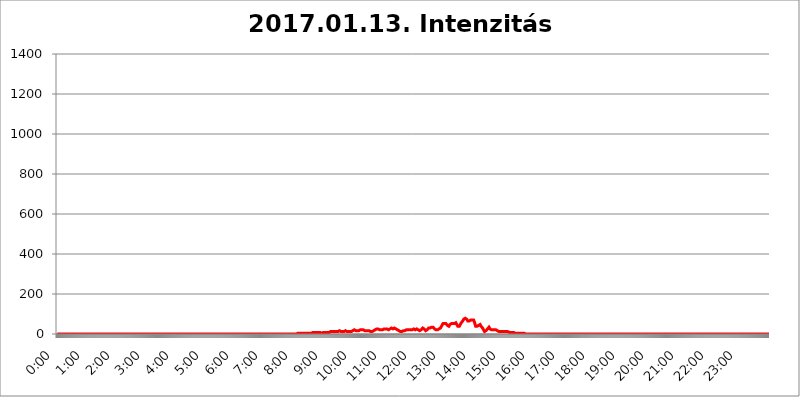
| Category | 2017.01.13. Intenzitás [W/m^2] |
|---|---|
| 0.0 | 0 |
| 0.0006944444444444445 | 0 |
| 0.001388888888888889 | 0 |
| 0.0020833333333333333 | 0 |
| 0.002777777777777778 | 0 |
| 0.003472222222222222 | 0 |
| 0.004166666666666667 | 0 |
| 0.004861111111111111 | 0 |
| 0.005555555555555556 | 0 |
| 0.0062499999999999995 | 0 |
| 0.006944444444444444 | 0 |
| 0.007638888888888889 | 0 |
| 0.008333333333333333 | 0 |
| 0.009027777777777779 | 0 |
| 0.009722222222222222 | 0 |
| 0.010416666666666666 | 0 |
| 0.011111111111111112 | 0 |
| 0.011805555555555555 | 0 |
| 0.012499999999999999 | 0 |
| 0.013194444444444444 | 0 |
| 0.013888888888888888 | 0 |
| 0.014583333333333332 | 0 |
| 0.015277777777777777 | 0 |
| 0.015972222222222224 | 0 |
| 0.016666666666666666 | 0 |
| 0.017361111111111112 | 0 |
| 0.018055555555555557 | 0 |
| 0.01875 | 0 |
| 0.019444444444444445 | 0 |
| 0.02013888888888889 | 0 |
| 0.020833333333333332 | 0 |
| 0.02152777777777778 | 0 |
| 0.022222222222222223 | 0 |
| 0.02291666666666667 | 0 |
| 0.02361111111111111 | 0 |
| 0.024305555555555556 | 0 |
| 0.024999999999999998 | 0 |
| 0.025694444444444447 | 0 |
| 0.02638888888888889 | 0 |
| 0.027083333333333334 | 0 |
| 0.027777777777777776 | 0 |
| 0.02847222222222222 | 0 |
| 0.029166666666666664 | 0 |
| 0.029861111111111113 | 0 |
| 0.030555555555555555 | 0 |
| 0.03125 | 0 |
| 0.03194444444444445 | 0 |
| 0.03263888888888889 | 0 |
| 0.03333333333333333 | 0 |
| 0.034027777777777775 | 0 |
| 0.034722222222222224 | 0 |
| 0.035416666666666666 | 0 |
| 0.036111111111111115 | 0 |
| 0.03680555555555556 | 0 |
| 0.0375 | 0 |
| 0.03819444444444444 | 0 |
| 0.03888888888888889 | 0 |
| 0.03958333333333333 | 0 |
| 0.04027777777777778 | 0 |
| 0.04097222222222222 | 0 |
| 0.041666666666666664 | 0 |
| 0.042361111111111106 | 0 |
| 0.04305555555555556 | 0 |
| 0.043750000000000004 | 0 |
| 0.044444444444444446 | 0 |
| 0.04513888888888889 | 0 |
| 0.04583333333333334 | 0 |
| 0.04652777777777778 | 0 |
| 0.04722222222222222 | 0 |
| 0.04791666666666666 | 0 |
| 0.04861111111111111 | 0 |
| 0.049305555555555554 | 0 |
| 0.049999999999999996 | 0 |
| 0.05069444444444445 | 0 |
| 0.051388888888888894 | 0 |
| 0.052083333333333336 | 0 |
| 0.05277777777777778 | 0 |
| 0.05347222222222222 | 0 |
| 0.05416666666666667 | 0 |
| 0.05486111111111111 | 0 |
| 0.05555555555555555 | 0 |
| 0.05625 | 0 |
| 0.05694444444444444 | 0 |
| 0.057638888888888885 | 0 |
| 0.05833333333333333 | 0 |
| 0.05902777777777778 | 0 |
| 0.059722222222222225 | 0 |
| 0.06041666666666667 | 0 |
| 0.061111111111111116 | 0 |
| 0.06180555555555556 | 0 |
| 0.0625 | 0 |
| 0.06319444444444444 | 0 |
| 0.06388888888888888 | 0 |
| 0.06458333333333334 | 0 |
| 0.06527777777777778 | 0 |
| 0.06597222222222222 | 0 |
| 0.06666666666666667 | 0 |
| 0.06736111111111111 | 0 |
| 0.06805555555555555 | 0 |
| 0.06874999999999999 | 0 |
| 0.06944444444444443 | 0 |
| 0.07013888888888889 | 0 |
| 0.07083333333333333 | 0 |
| 0.07152777777777779 | 0 |
| 0.07222222222222223 | 0 |
| 0.07291666666666667 | 0 |
| 0.07361111111111111 | 0 |
| 0.07430555555555556 | 0 |
| 0.075 | 0 |
| 0.07569444444444444 | 0 |
| 0.0763888888888889 | 0 |
| 0.07708333333333334 | 0 |
| 0.07777777777777778 | 0 |
| 0.07847222222222222 | 0 |
| 0.07916666666666666 | 0 |
| 0.0798611111111111 | 0 |
| 0.08055555555555556 | 0 |
| 0.08125 | 0 |
| 0.08194444444444444 | 0 |
| 0.08263888888888889 | 0 |
| 0.08333333333333333 | 0 |
| 0.08402777777777777 | 0 |
| 0.08472222222222221 | 0 |
| 0.08541666666666665 | 0 |
| 0.08611111111111112 | 0 |
| 0.08680555555555557 | 0 |
| 0.08750000000000001 | 0 |
| 0.08819444444444445 | 0 |
| 0.08888888888888889 | 0 |
| 0.08958333333333333 | 0 |
| 0.09027777777777778 | 0 |
| 0.09097222222222222 | 0 |
| 0.09166666666666667 | 0 |
| 0.09236111111111112 | 0 |
| 0.09305555555555556 | 0 |
| 0.09375 | 0 |
| 0.09444444444444444 | 0 |
| 0.09513888888888888 | 0 |
| 0.09583333333333333 | 0 |
| 0.09652777777777777 | 0 |
| 0.09722222222222222 | 0 |
| 0.09791666666666667 | 0 |
| 0.09861111111111111 | 0 |
| 0.09930555555555555 | 0 |
| 0.09999999999999999 | 0 |
| 0.10069444444444443 | 0 |
| 0.1013888888888889 | 0 |
| 0.10208333333333335 | 0 |
| 0.10277777777777779 | 0 |
| 0.10347222222222223 | 0 |
| 0.10416666666666667 | 0 |
| 0.10486111111111111 | 0 |
| 0.10555555555555556 | 0 |
| 0.10625 | 0 |
| 0.10694444444444444 | 0 |
| 0.1076388888888889 | 0 |
| 0.10833333333333334 | 0 |
| 0.10902777777777778 | 0 |
| 0.10972222222222222 | 0 |
| 0.1111111111111111 | 0 |
| 0.11180555555555556 | 0 |
| 0.11180555555555556 | 0 |
| 0.1125 | 0 |
| 0.11319444444444444 | 0 |
| 0.11388888888888889 | 0 |
| 0.11458333333333333 | 0 |
| 0.11527777777777777 | 0 |
| 0.11597222222222221 | 0 |
| 0.11666666666666665 | 0 |
| 0.1173611111111111 | 0 |
| 0.11805555555555557 | 0 |
| 0.11944444444444445 | 0 |
| 0.12013888888888889 | 0 |
| 0.12083333333333333 | 0 |
| 0.12152777777777778 | 0 |
| 0.12222222222222223 | 0 |
| 0.12291666666666667 | 0 |
| 0.12291666666666667 | 0 |
| 0.12361111111111112 | 0 |
| 0.12430555555555556 | 0 |
| 0.125 | 0 |
| 0.12569444444444444 | 0 |
| 0.12638888888888888 | 0 |
| 0.12708333333333333 | 0 |
| 0.16875 | 0 |
| 0.12847222222222224 | 0 |
| 0.12916666666666668 | 0 |
| 0.12986111111111112 | 0 |
| 0.13055555555555556 | 0 |
| 0.13125 | 0 |
| 0.13194444444444445 | 0 |
| 0.1326388888888889 | 0 |
| 0.13333333333333333 | 0 |
| 0.13402777777777777 | 0 |
| 0.13402777777777777 | 0 |
| 0.13472222222222222 | 0 |
| 0.13541666666666666 | 0 |
| 0.1361111111111111 | 0 |
| 0.13749999999999998 | 0 |
| 0.13819444444444443 | 0 |
| 0.1388888888888889 | 0 |
| 0.13958333333333334 | 0 |
| 0.14027777777777778 | 0 |
| 0.14097222222222222 | 0 |
| 0.14166666666666666 | 0 |
| 0.1423611111111111 | 0 |
| 0.14305555555555557 | 0 |
| 0.14375000000000002 | 0 |
| 0.14444444444444446 | 0 |
| 0.1451388888888889 | 0 |
| 0.1451388888888889 | 0 |
| 0.14652777777777778 | 0 |
| 0.14722222222222223 | 0 |
| 0.14791666666666667 | 0 |
| 0.1486111111111111 | 0 |
| 0.14930555555555555 | 0 |
| 0.15 | 0 |
| 0.15069444444444444 | 0 |
| 0.15138888888888888 | 0 |
| 0.15208333333333332 | 0 |
| 0.15277777777777776 | 0 |
| 0.15347222222222223 | 0 |
| 0.15416666666666667 | 0 |
| 0.15486111111111112 | 0 |
| 0.15555555555555556 | 0 |
| 0.15625 | 0 |
| 0.15694444444444444 | 0 |
| 0.15763888888888888 | 0 |
| 0.15833333333333333 | 0 |
| 0.15902777777777777 | 0 |
| 0.15972222222222224 | 0 |
| 0.16041666666666668 | 0 |
| 0.16111111111111112 | 0 |
| 0.16180555555555556 | 0 |
| 0.1625 | 0 |
| 0.16319444444444445 | 0 |
| 0.1638888888888889 | 0 |
| 0.16458333333333333 | 0 |
| 0.16527777777777777 | 0 |
| 0.16597222222222222 | 0 |
| 0.16666666666666666 | 0 |
| 0.1673611111111111 | 0 |
| 0.16805555555555554 | 0 |
| 0.16874999999999998 | 0 |
| 0.16944444444444443 | 0 |
| 0.17013888888888887 | 0 |
| 0.1708333333333333 | 0 |
| 0.17152777777777775 | 0 |
| 0.17222222222222225 | 0 |
| 0.1729166666666667 | 0 |
| 0.17361111111111113 | 0 |
| 0.17430555555555557 | 0 |
| 0.17500000000000002 | 0 |
| 0.17569444444444446 | 0 |
| 0.1763888888888889 | 0 |
| 0.17708333333333334 | 0 |
| 0.17777777777777778 | 0 |
| 0.17847222222222223 | 0 |
| 0.17916666666666667 | 0 |
| 0.1798611111111111 | 0 |
| 0.18055555555555555 | 0 |
| 0.18125 | 0 |
| 0.18194444444444444 | 0 |
| 0.1826388888888889 | 0 |
| 0.18333333333333335 | 0 |
| 0.1840277777777778 | 0 |
| 0.18472222222222223 | 0 |
| 0.18541666666666667 | 0 |
| 0.18611111111111112 | 0 |
| 0.18680555555555556 | 0 |
| 0.1875 | 0 |
| 0.18819444444444444 | 0 |
| 0.18888888888888888 | 0 |
| 0.18958333333333333 | 0 |
| 0.19027777777777777 | 0 |
| 0.1909722222222222 | 0 |
| 0.19166666666666665 | 0 |
| 0.19236111111111112 | 0 |
| 0.19305555555555554 | 0 |
| 0.19375 | 0 |
| 0.19444444444444445 | 0 |
| 0.1951388888888889 | 0 |
| 0.19583333333333333 | 0 |
| 0.19652777777777777 | 0 |
| 0.19722222222222222 | 0 |
| 0.19791666666666666 | 0 |
| 0.1986111111111111 | 0 |
| 0.19930555555555554 | 0 |
| 0.19999999999999998 | 0 |
| 0.20069444444444443 | 0 |
| 0.20138888888888887 | 0 |
| 0.2020833333333333 | 0 |
| 0.2027777777777778 | 0 |
| 0.2034722222222222 | 0 |
| 0.2041666666666667 | 0 |
| 0.20486111111111113 | 0 |
| 0.20555555555555557 | 0 |
| 0.20625000000000002 | 0 |
| 0.20694444444444446 | 0 |
| 0.2076388888888889 | 0 |
| 0.20833333333333334 | 0 |
| 0.20902777777777778 | 0 |
| 0.20972222222222223 | 0 |
| 0.21041666666666667 | 0 |
| 0.2111111111111111 | 0 |
| 0.21180555555555555 | 0 |
| 0.2125 | 0 |
| 0.21319444444444444 | 0 |
| 0.2138888888888889 | 0 |
| 0.21458333333333335 | 0 |
| 0.2152777777777778 | 0 |
| 0.21597222222222223 | 0 |
| 0.21666666666666667 | 0 |
| 0.21736111111111112 | 0 |
| 0.21805555555555556 | 0 |
| 0.21875 | 0 |
| 0.21944444444444444 | 0 |
| 0.22013888888888888 | 0 |
| 0.22083333333333333 | 0 |
| 0.22152777777777777 | 0 |
| 0.2222222222222222 | 0 |
| 0.22291666666666665 | 0 |
| 0.2236111111111111 | 0 |
| 0.22430555555555556 | 0 |
| 0.225 | 0 |
| 0.22569444444444445 | 0 |
| 0.2263888888888889 | 0 |
| 0.22708333333333333 | 0 |
| 0.22777777777777777 | 0 |
| 0.22847222222222222 | 0 |
| 0.22916666666666666 | 0 |
| 0.2298611111111111 | 0 |
| 0.23055555555555554 | 0 |
| 0.23124999999999998 | 0 |
| 0.23194444444444443 | 0 |
| 0.23263888888888887 | 0 |
| 0.2333333333333333 | 0 |
| 0.2340277777777778 | 0 |
| 0.2347222222222222 | 0 |
| 0.2354166666666667 | 0 |
| 0.23611111111111113 | 0 |
| 0.23680555555555557 | 0 |
| 0.23750000000000002 | 0 |
| 0.23819444444444446 | 0 |
| 0.2388888888888889 | 0 |
| 0.23958333333333334 | 0 |
| 0.24027777777777778 | 0 |
| 0.24097222222222223 | 0 |
| 0.24166666666666667 | 0 |
| 0.2423611111111111 | 0 |
| 0.24305555555555555 | 0 |
| 0.24375 | 0 |
| 0.24444444444444446 | 0 |
| 0.24513888888888888 | 0 |
| 0.24583333333333335 | 0 |
| 0.2465277777777778 | 0 |
| 0.24722222222222223 | 0 |
| 0.24791666666666667 | 0 |
| 0.24861111111111112 | 0 |
| 0.24930555555555556 | 0 |
| 0.25 | 0 |
| 0.25069444444444444 | 0 |
| 0.2513888888888889 | 0 |
| 0.2520833333333333 | 0 |
| 0.25277777777777777 | 0 |
| 0.2534722222222222 | 0 |
| 0.25416666666666665 | 0 |
| 0.2548611111111111 | 0 |
| 0.2555555555555556 | 0 |
| 0.25625000000000003 | 0 |
| 0.2569444444444445 | 0 |
| 0.2576388888888889 | 0 |
| 0.25833333333333336 | 0 |
| 0.2590277777777778 | 0 |
| 0.25972222222222224 | 0 |
| 0.2604166666666667 | 0 |
| 0.2611111111111111 | 0 |
| 0.26180555555555557 | 0 |
| 0.2625 | 0 |
| 0.26319444444444445 | 0 |
| 0.2638888888888889 | 0 |
| 0.26458333333333334 | 0 |
| 0.2652777777777778 | 0 |
| 0.2659722222222222 | 0 |
| 0.26666666666666666 | 0 |
| 0.2673611111111111 | 0 |
| 0.26805555555555555 | 0 |
| 0.26875 | 0 |
| 0.26944444444444443 | 0 |
| 0.2701388888888889 | 0 |
| 0.2708333333333333 | 0 |
| 0.27152777777777776 | 0 |
| 0.2722222222222222 | 0 |
| 0.27291666666666664 | 0 |
| 0.2736111111111111 | 0 |
| 0.2743055555555555 | 0 |
| 0.27499999999999997 | 0 |
| 0.27569444444444446 | 0 |
| 0.27638888888888885 | 0 |
| 0.27708333333333335 | 0 |
| 0.2777777777777778 | 0 |
| 0.27847222222222223 | 0 |
| 0.2791666666666667 | 0 |
| 0.2798611111111111 | 0 |
| 0.28055555555555556 | 0 |
| 0.28125 | 0 |
| 0.28194444444444444 | 0 |
| 0.2826388888888889 | 0 |
| 0.2833333333333333 | 0 |
| 0.28402777777777777 | 0 |
| 0.2847222222222222 | 0 |
| 0.28541666666666665 | 0 |
| 0.28611111111111115 | 0 |
| 0.28680555555555554 | 0 |
| 0.28750000000000003 | 0 |
| 0.2881944444444445 | 0 |
| 0.2888888888888889 | 0 |
| 0.28958333333333336 | 0 |
| 0.2902777777777778 | 0 |
| 0.29097222222222224 | 0 |
| 0.2916666666666667 | 0 |
| 0.2923611111111111 | 0 |
| 0.29305555555555557 | 0 |
| 0.29375 | 0 |
| 0.29444444444444445 | 0 |
| 0.2951388888888889 | 0 |
| 0.29583333333333334 | 0 |
| 0.2965277777777778 | 0 |
| 0.2972222222222222 | 0 |
| 0.29791666666666666 | 0 |
| 0.2986111111111111 | 0 |
| 0.29930555555555555 | 0 |
| 0.3 | 0 |
| 0.30069444444444443 | 0 |
| 0.3013888888888889 | 0 |
| 0.3020833333333333 | 0 |
| 0.30277777777777776 | 0 |
| 0.3034722222222222 | 0 |
| 0.30416666666666664 | 0 |
| 0.3048611111111111 | 0 |
| 0.3055555555555555 | 0 |
| 0.30624999999999997 | 0 |
| 0.3069444444444444 | 0 |
| 0.3076388888888889 | 0 |
| 0.30833333333333335 | 0 |
| 0.3090277777777778 | 0 |
| 0.30972222222222223 | 0 |
| 0.3104166666666667 | 0 |
| 0.3111111111111111 | 0 |
| 0.31180555555555556 | 0 |
| 0.3125 | 0 |
| 0.31319444444444444 | 0 |
| 0.3138888888888889 | 0 |
| 0.3145833333333333 | 0 |
| 0.31527777777777777 | 0 |
| 0.3159722222222222 | 0 |
| 0.31666666666666665 | 0 |
| 0.31736111111111115 | 0 |
| 0.31805555555555554 | 0 |
| 0.31875000000000003 | 0 |
| 0.3194444444444445 | 0 |
| 0.3201388888888889 | 0 |
| 0.32083333333333336 | 0 |
| 0.3215277777777778 | 0 |
| 0.32222222222222224 | 0 |
| 0.3229166666666667 | 0 |
| 0.3236111111111111 | 0 |
| 0.32430555555555557 | 0 |
| 0.325 | 0 |
| 0.32569444444444445 | 0 |
| 0.3263888888888889 | 0 |
| 0.32708333333333334 | 0 |
| 0.3277777777777778 | 0 |
| 0.3284722222222222 | 0 |
| 0.32916666666666666 | 0 |
| 0.3298611111111111 | 0 |
| 0.33055555555555555 | 0 |
| 0.33125 | 0 |
| 0.33194444444444443 | 0 |
| 0.3326388888888889 | 0 |
| 0.3333333333333333 | 0 |
| 0.3340277777777778 | 0 |
| 0.3347222222222222 | 0 |
| 0.3354166666666667 | 0 |
| 0.3361111111111111 | 3.525 |
| 0.3368055555555556 | 0 |
| 0.33749999999999997 | 3.525 |
| 0.33819444444444446 | 3.525 |
| 0.33888888888888885 | 3.525 |
| 0.33958333333333335 | 3.525 |
| 0.34027777777777773 | 3.525 |
| 0.34097222222222223 | 3.525 |
| 0.3416666666666666 | 3.525 |
| 0.3423611111111111 | 3.525 |
| 0.3430555555555555 | 3.525 |
| 0.34375 | 3.525 |
| 0.3444444444444445 | 3.525 |
| 0.3451388888888889 | 3.525 |
| 0.3458333333333334 | 3.525 |
| 0.34652777777777777 | 3.525 |
| 0.34722222222222227 | 3.525 |
| 0.34791666666666665 | 3.525 |
| 0.34861111111111115 | 3.525 |
| 0.34930555555555554 | 3.525 |
| 0.35000000000000003 | 3.525 |
| 0.3506944444444444 | 3.525 |
| 0.3513888888888889 | 3.525 |
| 0.3520833333333333 | 3.525 |
| 0.3527777777777778 | 3.525 |
| 0.3534722222222222 | 3.525 |
| 0.3541666666666667 | 3.525 |
| 0.3548611111111111 | 3.525 |
| 0.35555555555555557 | 3.525 |
| 0.35625 | 3.525 |
| 0.35694444444444445 | 3.525 |
| 0.3576388888888889 | 3.525 |
| 0.35833333333333334 | 7.887 |
| 0.3590277777777778 | 7.887 |
| 0.3597222222222222 | 7.887 |
| 0.36041666666666666 | 7.887 |
| 0.3611111111111111 | 7.887 |
| 0.36180555555555555 | 7.887 |
| 0.3625 | 7.887 |
| 0.36319444444444443 | 7.887 |
| 0.3638888888888889 | 7.887 |
| 0.3645833333333333 | 7.887 |
| 0.3652777777777778 | 7.887 |
| 0.3659722222222222 | 3.525 |
| 0.3666666666666667 | 7.887 |
| 0.3673611111111111 | 7.887 |
| 0.3680555555555556 | 3.525 |
| 0.36874999999999997 | 7.887 |
| 0.36944444444444446 | 3.525 |
| 0.37013888888888885 | 3.525 |
| 0.37083333333333335 | 3.525 |
| 0.37152777777777773 | 7.887 |
| 0.37222222222222223 | 3.525 |
| 0.3729166666666666 | 7.887 |
| 0.3736111111111111 | 3.525 |
| 0.3743055555555555 | 7.887 |
| 0.375 | 7.887 |
| 0.3756944444444445 | 7.887 |
| 0.3763888888888889 | 7.887 |
| 0.3770833333333334 | 7.887 |
| 0.37777777777777777 | 7.887 |
| 0.37847222222222227 | 7.887 |
| 0.37916666666666665 | 7.887 |
| 0.37986111111111115 | 7.887 |
| 0.38055555555555554 | 7.887 |
| 0.38125000000000003 | 7.887 |
| 0.3819444444444444 | 7.887 |
| 0.3826388888888889 | 12.257 |
| 0.3833333333333333 | 12.257 |
| 0.3840277777777778 | 12.257 |
| 0.3847222222222222 | 12.257 |
| 0.3854166666666667 | 12.257 |
| 0.3861111111111111 | 12.257 |
| 0.38680555555555557 | 12.257 |
| 0.3875 | 12.257 |
| 0.38819444444444445 | 12.257 |
| 0.3888888888888889 | 12.257 |
| 0.38958333333333334 | 12.257 |
| 0.3902777777777778 | 12.257 |
| 0.3909722222222222 | 12.257 |
| 0.39166666666666666 | 12.257 |
| 0.3923611111111111 | 12.257 |
| 0.39305555555555555 | 12.257 |
| 0.39375 | 12.257 |
| 0.39444444444444443 | 12.257 |
| 0.3951388888888889 | 12.257 |
| 0.3958333333333333 | 16.636 |
| 0.3965277777777778 | 12.257 |
| 0.3972222222222222 | 12.257 |
| 0.3979166666666667 | 12.257 |
| 0.3986111111111111 | 12.257 |
| 0.3993055555555556 | 12.257 |
| 0.39999999999999997 | 12.257 |
| 0.40069444444444446 | 12.257 |
| 0.40138888888888885 | 12.257 |
| 0.40208333333333335 | 12.257 |
| 0.40277777777777773 | 16.636 |
| 0.40347222222222223 | 16.636 |
| 0.4041666666666666 | 16.636 |
| 0.4048611111111111 | 16.636 |
| 0.4055555555555555 | 12.257 |
| 0.40625 | 12.257 |
| 0.4069444444444445 | 12.257 |
| 0.4076388888888889 | 12.257 |
| 0.4083333333333334 | 12.257 |
| 0.40902777777777777 | 12.257 |
| 0.40972222222222227 | 12.257 |
| 0.41041666666666665 | 12.257 |
| 0.41111111111111115 | 12.257 |
| 0.41180555555555554 | 12.257 |
| 0.41250000000000003 | 12.257 |
| 0.4131944444444444 | 12.257 |
| 0.4138888888888889 | 16.636 |
| 0.4145833333333333 | 16.636 |
| 0.4152777777777778 | 16.636 |
| 0.4159722222222222 | 16.636 |
| 0.4166666666666667 | 21.024 |
| 0.4173611111111111 | 16.636 |
| 0.41805555555555557 | 21.024 |
| 0.41875 | 16.636 |
| 0.41944444444444445 | 16.636 |
| 0.4201388888888889 | 16.636 |
| 0.42083333333333334 | 16.636 |
| 0.4215277777777778 | 16.636 |
| 0.4222222222222222 | 16.636 |
| 0.42291666666666666 | 16.636 |
| 0.4236111111111111 | 21.024 |
| 0.42430555555555555 | 21.024 |
| 0.425 | 21.024 |
| 0.42569444444444443 | 21.024 |
| 0.4263888888888889 | 21.024 |
| 0.4270833333333333 | 21.024 |
| 0.4277777777777778 | 21.024 |
| 0.4284722222222222 | 21.024 |
| 0.4291666666666667 | 21.024 |
| 0.4298611111111111 | 21.024 |
| 0.4305555555555556 | 21.024 |
| 0.43124999999999997 | 16.636 |
| 0.43194444444444446 | 16.636 |
| 0.43263888888888885 | 16.636 |
| 0.43333333333333335 | 16.636 |
| 0.43402777777777773 | 16.636 |
| 0.43472222222222223 | 16.636 |
| 0.4354166666666666 | 16.636 |
| 0.4361111111111111 | 16.636 |
| 0.4368055555555555 | 16.636 |
| 0.4375 | 16.636 |
| 0.4381944444444445 | 16.636 |
| 0.4388888888888889 | 12.257 |
| 0.4395833333333334 | 12.257 |
| 0.44027777777777777 | 12.257 |
| 0.44097222222222227 | 12.257 |
| 0.44166666666666665 | 12.257 |
| 0.44236111111111115 | 12.257 |
| 0.44305555555555554 | 16.636 |
| 0.44375000000000003 | 16.636 |
| 0.4444444444444444 | 16.636 |
| 0.4451388888888889 | 21.024 |
| 0.4458333333333333 | 21.024 |
| 0.4465277777777778 | 25.419 |
| 0.4472222222222222 | 25.419 |
| 0.4479166666666667 | 25.419 |
| 0.4486111111111111 | 25.419 |
| 0.44930555555555557 | 25.419 |
| 0.45 | 25.419 |
| 0.45069444444444445 | 25.419 |
| 0.4513888888888889 | 21.024 |
| 0.45208333333333334 | 21.024 |
| 0.4527777777777778 | 21.024 |
| 0.4534722222222222 | 21.024 |
| 0.45416666666666666 | 21.024 |
| 0.4548611111111111 | 21.024 |
| 0.45555555555555555 | 21.024 |
| 0.45625 | 21.024 |
| 0.45694444444444443 | 25.419 |
| 0.4576388888888889 | 25.419 |
| 0.4583333333333333 | 25.419 |
| 0.4590277777777778 | 25.419 |
| 0.4597222222222222 | 25.419 |
| 0.4604166666666667 | 25.419 |
| 0.4611111111111111 | 25.419 |
| 0.4618055555555556 | 25.419 |
| 0.46249999999999997 | 25.419 |
| 0.46319444444444446 | 21.024 |
| 0.46388888888888885 | 21.024 |
| 0.46458333333333335 | 21.024 |
| 0.46527777777777773 | 21.024 |
| 0.46597222222222223 | 25.419 |
| 0.4666666666666666 | 25.419 |
| 0.4673611111111111 | 25.419 |
| 0.4680555555555555 | 29.823 |
| 0.46875 | 29.823 |
| 0.4694444444444445 | 29.823 |
| 0.4701388888888889 | 25.419 |
| 0.4708333333333334 | 25.419 |
| 0.47152777777777777 | 25.419 |
| 0.47222222222222227 | 25.419 |
| 0.47291666666666665 | 29.823 |
| 0.47361111111111115 | 29.823 |
| 0.47430555555555554 | 29.823 |
| 0.47500000000000003 | 25.419 |
| 0.4756944444444444 | 21.024 |
| 0.4763888888888889 | 21.024 |
| 0.4770833333333333 | 21.024 |
| 0.4777777777777778 | 21.024 |
| 0.4784722222222222 | 16.636 |
| 0.4791666666666667 | 16.636 |
| 0.4798611111111111 | 16.636 |
| 0.48055555555555557 | 12.257 |
| 0.48125 | 12.257 |
| 0.48194444444444445 | 12.257 |
| 0.4826388888888889 | 12.257 |
| 0.48333333333333334 | 12.257 |
| 0.4840277777777778 | 12.257 |
| 0.4847222222222222 | 16.636 |
| 0.48541666666666666 | 16.636 |
| 0.4861111111111111 | 16.636 |
| 0.48680555555555555 | 16.636 |
| 0.4875 | 16.636 |
| 0.48819444444444443 | 16.636 |
| 0.4888888888888889 | 21.024 |
| 0.4895833333333333 | 21.024 |
| 0.4902777777777778 | 16.636 |
| 0.4909722222222222 | 21.024 |
| 0.4916666666666667 | 21.024 |
| 0.4923611111111111 | 21.024 |
| 0.4930555555555556 | 21.024 |
| 0.49374999999999997 | 21.024 |
| 0.49444444444444446 | 21.024 |
| 0.49513888888888885 | 21.024 |
| 0.49583333333333335 | 21.024 |
| 0.49652777777777773 | 21.024 |
| 0.49722222222222223 | 21.024 |
| 0.4979166666666666 | 21.024 |
| 0.4986111111111111 | 21.024 |
| 0.4993055555555555 | 21.024 |
| 0.5 | 25.419 |
| 0.5006944444444444 | 25.419 |
| 0.5013888888888889 | 25.419 |
| 0.5020833333333333 | 21.024 |
| 0.5027777777777778 | 25.419 |
| 0.5034722222222222 | 25.419 |
| 0.5041666666666667 | 25.419 |
| 0.5048611111111111 | 25.419 |
| 0.5055555555555555 | 21.024 |
| 0.50625 | 21.024 |
| 0.5069444444444444 | 21.024 |
| 0.5076388888888889 | 16.636 |
| 0.5083333333333333 | 16.636 |
| 0.5090277777777777 | 21.024 |
| 0.5097222222222222 | 21.024 |
| 0.5104166666666666 | 21.024 |
| 0.5111111111111112 | 25.419 |
| 0.5118055555555555 | 25.419 |
| 0.5125000000000001 | 29.823 |
| 0.5131944444444444 | 29.823 |
| 0.513888888888889 | 29.823 |
| 0.5145833333333333 | 25.419 |
| 0.5152777777777778 | 25.419 |
| 0.5159722222222222 | 21.024 |
| 0.5166666666666667 | 16.636 |
| 0.517361111111111 | 16.636 |
| 0.5180555555555556 | 16.636 |
| 0.5187499999999999 | 21.024 |
| 0.5194444444444445 | 25.419 |
| 0.5201388888888888 | 25.419 |
| 0.5208333333333334 | 29.823 |
| 0.5215277777777778 | 29.823 |
| 0.5222222222222223 | 29.823 |
| 0.5229166666666667 | 29.823 |
| 0.5236111111111111 | 34.234 |
| 0.5243055555555556 | 34.234 |
| 0.525 | 34.234 |
| 0.5256944444444445 | 34.234 |
| 0.5263888888888889 | 34.234 |
| 0.5270833333333333 | 34.234 |
| 0.5277777777777778 | 34.234 |
| 0.5284722222222222 | 29.823 |
| 0.5291666666666667 | 25.419 |
| 0.5298611111111111 | 25.419 |
| 0.5305555555555556 | 25.419 |
| 0.53125 | 21.024 |
| 0.5319444444444444 | 21.024 |
| 0.5326388888888889 | 21.024 |
| 0.5333333333333333 | 21.024 |
| 0.5340277777777778 | 21.024 |
| 0.5347222222222222 | 21.024 |
| 0.5354166666666667 | 25.419 |
| 0.5361111111111111 | 29.823 |
| 0.5368055555555555 | 29.823 |
| 0.5375 | 29.823 |
| 0.5381944444444444 | 34.234 |
| 0.5388888888888889 | 38.653 |
| 0.5395833333333333 | 38.653 |
| 0.5402777777777777 | 43.079 |
| 0.5409722222222222 | 51.951 |
| 0.5416666666666666 | 51.951 |
| 0.5423611111111112 | 51.951 |
| 0.5430555555555555 | 51.951 |
| 0.5437500000000001 | 56.398 |
| 0.5444444444444444 | 56.398 |
| 0.545138888888889 | 51.951 |
| 0.5458333333333333 | 47.511 |
| 0.5465277777777778 | 47.511 |
| 0.5472222222222222 | 43.079 |
| 0.5479166666666667 | 43.079 |
| 0.548611111111111 | 38.653 |
| 0.5493055555555556 | 38.653 |
| 0.5499999999999999 | 43.079 |
| 0.5506944444444445 | 47.511 |
| 0.5513888888888888 | 47.511 |
| 0.5520833333333334 | 51.951 |
| 0.5527777777777778 | 51.951 |
| 0.5534722222222223 | 56.398 |
| 0.5541666666666667 | 56.398 |
| 0.5548611111111111 | 51.951 |
| 0.5555555555555556 | 51.951 |
| 0.55625 | 51.951 |
| 0.5569444444444445 | 51.951 |
| 0.5576388888888889 | 56.398 |
| 0.5583333333333333 | 56.398 |
| 0.5590277777777778 | 56.398 |
| 0.5597222222222222 | 51.951 |
| 0.5604166666666667 | 47.511 |
| 0.5611111111111111 | 43.079 |
| 0.5618055555555556 | 38.653 |
| 0.5625 | 38.653 |
| 0.5631944444444444 | 38.653 |
| 0.5638888888888889 | 38.653 |
| 0.5645833333333333 | 43.079 |
| 0.5652777777777778 | 47.511 |
| 0.5659722222222222 | 47.511 |
| 0.5666666666666667 | 56.398 |
| 0.5673611111111111 | 56.398 |
| 0.5680555555555555 | 60.85 |
| 0.56875 | 65.31 |
| 0.5694444444444444 | 69.775 |
| 0.5701388888888889 | 74.246 |
| 0.5708333333333333 | 74.246 |
| 0.5715277777777777 | 78.722 |
| 0.5722222222222222 | 78.722 |
| 0.5729166666666666 | 74.246 |
| 0.5736111111111112 | 74.246 |
| 0.5743055555555555 | 74.246 |
| 0.5750000000000001 | 69.775 |
| 0.5756944444444444 | 65.31 |
| 0.576388888888889 | 65.31 |
| 0.5770833333333333 | 60.85 |
| 0.5777777777777778 | 65.31 |
| 0.5784722222222222 | 65.31 |
| 0.5791666666666667 | 65.31 |
| 0.579861111111111 | 69.775 |
| 0.5805555555555556 | 69.775 |
| 0.5812499999999999 | 69.775 |
| 0.5819444444444445 | 69.775 |
| 0.5826388888888888 | 65.31 |
| 0.5833333333333334 | 69.775 |
| 0.5840277777777778 | 69.775 |
| 0.5847222222222223 | 65.31 |
| 0.5854166666666667 | 56.398 |
| 0.5861111111111111 | 47.511 |
| 0.5868055555555556 | 38.653 |
| 0.5875 | 34.234 |
| 0.5881944444444445 | 34.234 |
| 0.5888888888888889 | 38.653 |
| 0.5895833333333333 | 38.653 |
| 0.5902777777777778 | 43.079 |
| 0.5909722222222222 | 43.079 |
| 0.5916666666666667 | 43.079 |
| 0.5923611111111111 | 47.511 |
| 0.5930555555555556 | 47.511 |
| 0.59375 | 43.079 |
| 0.5944444444444444 | 38.653 |
| 0.5951388888888889 | 38.653 |
| 0.5958333333333333 | 34.234 |
| 0.5965277777777778 | 29.823 |
| 0.5972222222222222 | 25.419 |
| 0.5979166666666667 | 21.024 |
| 0.5986111111111111 | 16.636 |
| 0.5993055555555555 | 12.257 |
| 0.6 | 12.257 |
| 0.6006944444444444 | 12.257 |
| 0.6013888888888889 | 16.636 |
| 0.6020833333333333 | 16.636 |
| 0.6027777777777777 | 21.024 |
| 0.6034722222222222 | 25.419 |
| 0.6041666666666666 | 29.823 |
| 0.6048611111111112 | 29.823 |
| 0.6055555555555555 | 34.234 |
| 0.6062500000000001 | 29.823 |
| 0.6069444444444444 | 25.419 |
| 0.607638888888889 | 21.024 |
| 0.6083333333333333 | 21.024 |
| 0.6090277777777778 | 21.024 |
| 0.6097222222222222 | 21.024 |
| 0.6104166666666667 | 21.024 |
| 0.611111111111111 | 21.024 |
| 0.6118055555555556 | 21.024 |
| 0.6124999999999999 | 21.024 |
| 0.6131944444444445 | 21.024 |
| 0.6138888888888888 | 21.024 |
| 0.6145833333333334 | 21.024 |
| 0.6152777777777778 | 21.024 |
| 0.6159722222222223 | 21.024 |
| 0.6166666666666667 | 16.636 |
| 0.6173611111111111 | 16.636 |
| 0.6180555555555556 | 16.636 |
| 0.61875 | 16.636 |
| 0.6194444444444445 | 12.257 |
| 0.6201388888888889 | 12.257 |
| 0.6208333333333333 | 12.257 |
| 0.6215277777777778 | 12.257 |
| 0.6222222222222222 | 12.257 |
| 0.6229166666666667 | 12.257 |
| 0.6236111111111111 | 12.257 |
| 0.6243055555555556 | 12.257 |
| 0.625 | 12.257 |
| 0.6256944444444444 | 12.257 |
| 0.6263888888888889 | 12.257 |
| 0.6270833333333333 | 12.257 |
| 0.6277777777777778 | 12.257 |
| 0.6284722222222222 | 12.257 |
| 0.6291666666666667 | 12.257 |
| 0.6298611111111111 | 12.257 |
| 0.6305555555555555 | 12.257 |
| 0.63125 | 12.257 |
| 0.6319444444444444 | 12.257 |
| 0.6326388888888889 | 7.887 |
| 0.6333333333333333 | 7.887 |
| 0.6340277777777777 | 7.887 |
| 0.6347222222222222 | 7.887 |
| 0.6354166666666666 | 7.887 |
| 0.6361111111111112 | 7.887 |
| 0.6368055555555555 | 7.887 |
| 0.6375000000000001 | 7.887 |
| 0.6381944444444444 | 7.887 |
| 0.638888888888889 | 7.887 |
| 0.6395833333333333 | 7.887 |
| 0.6402777777777778 | 7.887 |
| 0.6409722222222222 | 7.887 |
| 0.6416666666666667 | 7.887 |
| 0.642361111111111 | 3.525 |
| 0.6430555555555556 | 3.525 |
| 0.6437499999999999 | 3.525 |
| 0.6444444444444445 | 3.525 |
| 0.6451388888888888 | 3.525 |
| 0.6458333333333334 | 3.525 |
| 0.6465277777777778 | 3.525 |
| 0.6472222222222223 | 3.525 |
| 0.6479166666666667 | 3.525 |
| 0.6486111111111111 | 3.525 |
| 0.6493055555555556 | 3.525 |
| 0.65 | 3.525 |
| 0.6506944444444445 | 3.525 |
| 0.6513888888888889 | 3.525 |
| 0.6520833333333333 | 3.525 |
| 0.6527777777777778 | 3.525 |
| 0.6534722222222222 | 3.525 |
| 0.6541666666666667 | 3.525 |
| 0.6548611111111111 | 3.525 |
| 0.6555555555555556 | 0 |
| 0.65625 | 0 |
| 0.6569444444444444 | 0 |
| 0.6576388888888889 | 0 |
| 0.6583333333333333 | 0 |
| 0.6590277777777778 | 0 |
| 0.6597222222222222 | 0 |
| 0.6604166666666667 | 0 |
| 0.6611111111111111 | 0 |
| 0.6618055555555555 | 0 |
| 0.6625 | 0 |
| 0.6631944444444444 | 0 |
| 0.6638888888888889 | 0 |
| 0.6645833333333333 | 0 |
| 0.6652777777777777 | 0 |
| 0.6659722222222222 | 0 |
| 0.6666666666666666 | 0 |
| 0.6673611111111111 | 0 |
| 0.6680555555555556 | 0 |
| 0.6687500000000001 | 0 |
| 0.6694444444444444 | 0 |
| 0.6701388888888888 | 0 |
| 0.6708333333333334 | 0 |
| 0.6715277777777778 | 0 |
| 0.6722222222222222 | 0 |
| 0.6729166666666666 | 0 |
| 0.6736111111111112 | 0 |
| 0.6743055555555556 | 0 |
| 0.6749999999999999 | 0 |
| 0.6756944444444444 | 0 |
| 0.6763888888888889 | 0 |
| 0.6770833333333334 | 0 |
| 0.6777777777777777 | 0 |
| 0.6784722222222223 | 0 |
| 0.6791666666666667 | 0 |
| 0.6798611111111111 | 0 |
| 0.6805555555555555 | 0 |
| 0.68125 | 0 |
| 0.6819444444444445 | 0 |
| 0.6826388888888889 | 0 |
| 0.6833333333333332 | 0 |
| 0.6840277777777778 | 0 |
| 0.6847222222222222 | 0 |
| 0.6854166666666667 | 0 |
| 0.686111111111111 | 0 |
| 0.6868055555555556 | 0 |
| 0.6875 | 0 |
| 0.6881944444444444 | 0 |
| 0.688888888888889 | 0 |
| 0.6895833333333333 | 0 |
| 0.6902777777777778 | 0 |
| 0.6909722222222222 | 0 |
| 0.6916666666666668 | 0 |
| 0.6923611111111111 | 0 |
| 0.6930555555555555 | 0 |
| 0.69375 | 0 |
| 0.6944444444444445 | 0 |
| 0.6951388888888889 | 0 |
| 0.6958333333333333 | 0 |
| 0.6965277777777777 | 0 |
| 0.6972222222222223 | 0 |
| 0.6979166666666666 | 0 |
| 0.6986111111111111 | 0 |
| 0.6993055555555556 | 0 |
| 0.7000000000000001 | 0 |
| 0.7006944444444444 | 0 |
| 0.7013888888888888 | 0 |
| 0.7020833333333334 | 0 |
| 0.7027777777777778 | 0 |
| 0.7034722222222222 | 0 |
| 0.7041666666666666 | 0 |
| 0.7048611111111112 | 0 |
| 0.7055555555555556 | 0 |
| 0.7062499999999999 | 0 |
| 0.7069444444444444 | 0 |
| 0.7076388888888889 | 0 |
| 0.7083333333333334 | 0 |
| 0.7090277777777777 | 0 |
| 0.7097222222222223 | 0 |
| 0.7104166666666667 | 0 |
| 0.7111111111111111 | 0 |
| 0.7118055555555555 | 0 |
| 0.7125 | 0 |
| 0.7131944444444445 | 0 |
| 0.7138888888888889 | 0 |
| 0.7145833333333332 | 0 |
| 0.7152777777777778 | 0 |
| 0.7159722222222222 | 0 |
| 0.7166666666666667 | 0 |
| 0.717361111111111 | 0 |
| 0.7180555555555556 | 0 |
| 0.71875 | 0 |
| 0.7194444444444444 | 0 |
| 0.720138888888889 | 0 |
| 0.7208333333333333 | 0 |
| 0.7215277777777778 | 0 |
| 0.7222222222222222 | 0 |
| 0.7229166666666668 | 0 |
| 0.7236111111111111 | 0 |
| 0.7243055555555555 | 0 |
| 0.725 | 0 |
| 0.7256944444444445 | 0 |
| 0.7263888888888889 | 0 |
| 0.7270833333333333 | 0 |
| 0.7277777777777777 | 0 |
| 0.7284722222222223 | 0 |
| 0.7291666666666666 | 0 |
| 0.7298611111111111 | 0 |
| 0.7305555555555556 | 0 |
| 0.7312500000000001 | 0 |
| 0.7319444444444444 | 0 |
| 0.7326388888888888 | 0 |
| 0.7333333333333334 | 0 |
| 0.7340277777777778 | 0 |
| 0.7347222222222222 | 0 |
| 0.7354166666666666 | 0 |
| 0.7361111111111112 | 0 |
| 0.7368055555555556 | 0 |
| 0.7374999999999999 | 0 |
| 0.7381944444444444 | 0 |
| 0.7388888888888889 | 0 |
| 0.7395833333333334 | 0 |
| 0.7402777777777777 | 0 |
| 0.7409722222222223 | 0 |
| 0.7416666666666667 | 0 |
| 0.7423611111111111 | 0 |
| 0.7430555555555555 | 0 |
| 0.74375 | 0 |
| 0.7444444444444445 | 0 |
| 0.7451388888888889 | 0 |
| 0.7458333333333332 | 0 |
| 0.7465277777777778 | 0 |
| 0.7472222222222222 | 0 |
| 0.7479166666666667 | 0 |
| 0.748611111111111 | 0 |
| 0.7493055555555556 | 0 |
| 0.75 | 0 |
| 0.7506944444444444 | 0 |
| 0.751388888888889 | 0 |
| 0.7520833333333333 | 0 |
| 0.7527777777777778 | 0 |
| 0.7534722222222222 | 0 |
| 0.7541666666666668 | 0 |
| 0.7548611111111111 | 0 |
| 0.7555555555555555 | 0 |
| 0.75625 | 0 |
| 0.7569444444444445 | 0 |
| 0.7576388888888889 | 0 |
| 0.7583333333333333 | 0 |
| 0.7590277777777777 | 0 |
| 0.7597222222222223 | 0 |
| 0.7604166666666666 | 0 |
| 0.7611111111111111 | 0 |
| 0.7618055555555556 | 0 |
| 0.7625000000000001 | 0 |
| 0.7631944444444444 | 0 |
| 0.7638888888888888 | 0 |
| 0.7645833333333334 | 0 |
| 0.7652777777777778 | 0 |
| 0.7659722222222222 | 0 |
| 0.7666666666666666 | 0 |
| 0.7673611111111112 | 0 |
| 0.7680555555555556 | 0 |
| 0.7687499999999999 | 0 |
| 0.7694444444444444 | 0 |
| 0.7701388888888889 | 0 |
| 0.7708333333333334 | 0 |
| 0.7715277777777777 | 0 |
| 0.7722222222222223 | 0 |
| 0.7729166666666667 | 0 |
| 0.7736111111111111 | 0 |
| 0.7743055555555555 | 0 |
| 0.775 | 0 |
| 0.7756944444444445 | 0 |
| 0.7763888888888889 | 0 |
| 0.7770833333333332 | 0 |
| 0.7777777777777778 | 0 |
| 0.7784722222222222 | 0 |
| 0.7791666666666667 | 0 |
| 0.779861111111111 | 0 |
| 0.7805555555555556 | 0 |
| 0.78125 | 0 |
| 0.7819444444444444 | 0 |
| 0.782638888888889 | 0 |
| 0.7833333333333333 | 0 |
| 0.7840277777777778 | 0 |
| 0.7847222222222222 | 0 |
| 0.7854166666666668 | 0 |
| 0.7861111111111111 | 0 |
| 0.7868055555555555 | 0 |
| 0.7875 | 0 |
| 0.7881944444444445 | 0 |
| 0.7888888888888889 | 0 |
| 0.7895833333333333 | 0 |
| 0.7902777777777777 | 0 |
| 0.7909722222222223 | 0 |
| 0.7916666666666666 | 0 |
| 0.7923611111111111 | 0 |
| 0.7930555555555556 | 0 |
| 0.7937500000000001 | 0 |
| 0.7944444444444444 | 0 |
| 0.7951388888888888 | 0 |
| 0.7958333333333334 | 0 |
| 0.7965277777777778 | 0 |
| 0.7972222222222222 | 0 |
| 0.7979166666666666 | 0 |
| 0.7986111111111112 | 0 |
| 0.7993055555555556 | 0 |
| 0.7999999999999999 | 0 |
| 0.8006944444444444 | 0 |
| 0.8013888888888889 | 0 |
| 0.8020833333333334 | 0 |
| 0.8027777777777777 | 0 |
| 0.8034722222222223 | 0 |
| 0.8041666666666667 | 0 |
| 0.8048611111111111 | 0 |
| 0.8055555555555555 | 0 |
| 0.80625 | 0 |
| 0.8069444444444445 | 0 |
| 0.8076388888888889 | 0 |
| 0.8083333333333332 | 0 |
| 0.8090277777777778 | 0 |
| 0.8097222222222222 | 0 |
| 0.8104166666666667 | 0 |
| 0.811111111111111 | 0 |
| 0.8118055555555556 | 0 |
| 0.8125 | 0 |
| 0.8131944444444444 | 0 |
| 0.813888888888889 | 0 |
| 0.8145833333333333 | 0 |
| 0.8152777777777778 | 0 |
| 0.8159722222222222 | 0 |
| 0.8166666666666668 | 0 |
| 0.8173611111111111 | 0 |
| 0.8180555555555555 | 0 |
| 0.81875 | 0 |
| 0.8194444444444445 | 0 |
| 0.8201388888888889 | 0 |
| 0.8208333333333333 | 0 |
| 0.8215277777777777 | 0 |
| 0.8222222222222223 | 0 |
| 0.8229166666666666 | 0 |
| 0.8236111111111111 | 0 |
| 0.8243055555555556 | 0 |
| 0.8250000000000001 | 0 |
| 0.8256944444444444 | 0 |
| 0.8263888888888888 | 0 |
| 0.8270833333333334 | 0 |
| 0.8277777777777778 | 0 |
| 0.8284722222222222 | 0 |
| 0.8291666666666666 | 0 |
| 0.8298611111111112 | 0 |
| 0.8305555555555556 | 0 |
| 0.8312499999999999 | 0 |
| 0.8319444444444444 | 0 |
| 0.8326388888888889 | 0 |
| 0.8333333333333334 | 0 |
| 0.8340277777777777 | 0 |
| 0.8347222222222223 | 0 |
| 0.8354166666666667 | 0 |
| 0.8361111111111111 | 0 |
| 0.8368055555555555 | 0 |
| 0.8375 | 0 |
| 0.8381944444444445 | 0 |
| 0.8388888888888889 | 0 |
| 0.8395833333333332 | 0 |
| 0.8402777777777778 | 0 |
| 0.8409722222222222 | 0 |
| 0.8416666666666667 | 0 |
| 0.842361111111111 | 0 |
| 0.8430555555555556 | 0 |
| 0.84375 | 0 |
| 0.8444444444444444 | 0 |
| 0.845138888888889 | 0 |
| 0.8458333333333333 | 0 |
| 0.8465277777777778 | 0 |
| 0.8472222222222222 | 0 |
| 0.8479166666666668 | 0 |
| 0.8486111111111111 | 0 |
| 0.8493055555555555 | 0 |
| 0.85 | 0 |
| 0.8506944444444445 | 0 |
| 0.8513888888888889 | 0 |
| 0.8520833333333333 | 0 |
| 0.8527777777777777 | 0 |
| 0.8534722222222223 | 0 |
| 0.8541666666666666 | 0 |
| 0.8548611111111111 | 0 |
| 0.8555555555555556 | 0 |
| 0.8562500000000001 | 0 |
| 0.8569444444444444 | 0 |
| 0.8576388888888888 | 0 |
| 0.8583333333333334 | 0 |
| 0.8590277777777778 | 0 |
| 0.8597222222222222 | 0 |
| 0.8604166666666666 | 0 |
| 0.8611111111111112 | 0 |
| 0.8618055555555556 | 0 |
| 0.8624999999999999 | 0 |
| 0.8631944444444444 | 0 |
| 0.8638888888888889 | 0 |
| 0.8645833333333334 | 0 |
| 0.8652777777777777 | 0 |
| 0.8659722222222223 | 0 |
| 0.8666666666666667 | 0 |
| 0.8673611111111111 | 0 |
| 0.8680555555555555 | 0 |
| 0.86875 | 0 |
| 0.8694444444444445 | 0 |
| 0.8701388888888889 | 0 |
| 0.8708333333333332 | 0 |
| 0.8715277777777778 | 0 |
| 0.8722222222222222 | 0 |
| 0.8729166666666667 | 0 |
| 0.873611111111111 | 0 |
| 0.8743055555555556 | 0 |
| 0.875 | 0 |
| 0.8756944444444444 | 0 |
| 0.876388888888889 | 0 |
| 0.8770833333333333 | 0 |
| 0.8777777777777778 | 0 |
| 0.8784722222222222 | 0 |
| 0.8791666666666668 | 0 |
| 0.8798611111111111 | 0 |
| 0.8805555555555555 | 0 |
| 0.88125 | 0 |
| 0.8819444444444445 | 0 |
| 0.8826388888888889 | 0 |
| 0.8833333333333333 | 0 |
| 0.8840277777777777 | 0 |
| 0.8847222222222223 | 0 |
| 0.8854166666666666 | 0 |
| 0.8861111111111111 | 0 |
| 0.8868055555555556 | 0 |
| 0.8875000000000001 | 0 |
| 0.8881944444444444 | 0 |
| 0.8888888888888888 | 0 |
| 0.8895833333333334 | 0 |
| 0.8902777777777778 | 0 |
| 0.8909722222222222 | 0 |
| 0.8916666666666666 | 0 |
| 0.8923611111111112 | 0 |
| 0.8930555555555556 | 0 |
| 0.8937499999999999 | 0 |
| 0.8944444444444444 | 0 |
| 0.8951388888888889 | 0 |
| 0.8958333333333334 | 0 |
| 0.8965277777777777 | 0 |
| 0.8972222222222223 | 0 |
| 0.8979166666666667 | 0 |
| 0.8986111111111111 | 0 |
| 0.8993055555555555 | 0 |
| 0.9 | 0 |
| 0.9006944444444445 | 0 |
| 0.9013888888888889 | 0 |
| 0.9020833333333332 | 0 |
| 0.9027777777777778 | 0 |
| 0.9034722222222222 | 0 |
| 0.9041666666666667 | 0 |
| 0.904861111111111 | 0 |
| 0.9055555555555556 | 0 |
| 0.90625 | 0 |
| 0.9069444444444444 | 0 |
| 0.907638888888889 | 0 |
| 0.9083333333333333 | 0 |
| 0.9090277777777778 | 0 |
| 0.9097222222222222 | 0 |
| 0.9104166666666668 | 0 |
| 0.9111111111111111 | 0 |
| 0.9118055555555555 | 0 |
| 0.9125 | 0 |
| 0.9131944444444445 | 0 |
| 0.9138888888888889 | 0 |
| 0.9145833333333333 | 0 |
| 0.9152777777777777 | 0 |
| 0.9159722222222223 | 0 |
| 0.9166666666666666 | 0 |
| 0.9173611111111111 | 0 |
| 0.9180555555555556 | 0 |
| 0.9187500000000001 | 0 |
| 0.9194444444444444 | 0 |
| 0.9201388888888888 | 0 |
| 0.9208333333333334 | 0 |
| 0.9215277777777778 | 0 |
| 0.9222222222222222 | 0 |
| 0.9229166666666666 | 0 |
| 0.9236111111111112 | 0 |
| 0.9243055555555556 | 0 |
| 0.9249999999999999 | 0 |
| 0.9256944444444444 | 0 |
| 0.9263888888888889 | 0 |
| 0.9270833333333334 | 0 |
| 0.9277777777777777 | 0 |
| 0.9284722222222223 | 0 |
| 0.9291666666666667 | 0 |
| 0.9298611111111111 | 0 |
| 0.9305555555555555 | 0 |
| 0.93125 | 0 |
| 0.9319444444444445 | 0 |
| 0.9326388888888889 | 0 |
| 0.9333333333333332 | 0 |
| 0.9340277777777778 | 0 |
| 0.9347222222222222 | 0 |
| 0.9354166666666667 | 0 |
| 0.936111111111111 | 0 |
| 0.9368055555555556 | 0 |
| 0.9375 | 0 |
| 0.9381944444444444 | 0 |
| 0.938888888888889 | 0 |
| 0.9395833333333333 | 0 |
| 0.9402777777777778 | 0 |
| 0.9409722222222222 | 0 |
| 0.9416666666666668 | 0 |
| 0.9423611111111111 | 0 |
| 0.9430555555555555 | 0 |
| 0.94375 | 0 |
| 0.9444444444444445 | 0 |
| 0.9451388888888889 | 0 |
| 0.9458333333333333 | 0 |
| 0.9465277777777777 | 0 |
| 0.9472222222222223 | 0 |
| 0.9479166666666666 | 0 |
| 0.9486111111111111 | 0 |
| 0.9493055555555556 | 0 |
| 0.9500000000000001 | 0 |
| 0.9506944444444444 | 0 |
| 0.9513888888888888 | 0 |
| 0.9520833333333334 | 0 |
| 0.9527777777777778 | 0 |
| 0.9534722222222222 | 0 |
| 0.9541666666666666 | 0 |
| 0.9548611111111112 | 0 |
| 0.9555555555555556 | 0 |
| 0.9562499999999999 | 0 |
| 0.9569444444444444 | 0 |
| 0.9576388888888889 | 0 |
| 0.9583333333333334 | 0 |
| 0.9590277777777777 | 0 |
| 0.9597222222222223 | 0 |
| 0.9604166666666667 | 0 |
| 0.9611111111111111 | 0 |
| 0.9618055555555555 | 0 |
| 0.9625 | 0 |
| 0.9631944444444445 | 0 |
| 0.9638888888888889 | 0 |
| 0.9645833333333332 | 0 |
| 0.9652777777777778 | 0 |
| 0.9659722222222222 | 0 |
| 0.9666666666666667 | 0 |
| 0.967361111111111 | 0 |
| 0.9680555555555556 | 0 |
| 0.96875 | 0 |
| 0.9694444444444444 | 0 |
| 0.970138888888889 | 0 |
| 0.9708333333333333 | 0 |
| 0.9715277777777778 | 0 |
| 0.9722222222222222 | 0 |
| 0.9729166666666668 | 0 |
| 0.9736111111111111 | 0 |
| 0.9743055555555555 | 0 |
| 0.975 | 0 |
| 0.9756944444444445 | 0 |
| 0.9763888888888889 | 0 |
| 0.9770833333333333 | 0 |
| 0.9777777777777777 | 0 |
| 0.9784722222222223 | 0 |
| 0.9791666666666666 | 0 |
| 0.9798611111111111 | 0 |
| 0.9805555555555556 | 0 |
| 0.9812500000000001 | 0 |
| 0.9819444444444444 | 0 |
| 0.9826388888888888 | 0 |
| 0.9833333333333334 | 0 |
| 0.9840277777777778 | 0 |
| 0.9847222222222222 | 0 |
| 0.9854166666666666 | 0 |
| 0.9861111111111112 | 0 |
| 0.9868055555555556 | 0 |
| 0.9874999999999999 | 0 |
| 0.9881944444444444 | 0 |
| 0.9888888888888889 | 0 |
| 0.9895833333333334 | 0 |
| 0.9902777777777777 | 0 |
| 0.9909722222222223 | 0 |
| 0.9916666666666667 | 0 |
| 0.9923611111111111 | 0 |
| 0.9930555555555555 | 0 |
| 0.99375 | 0 |
| 0.9944444444444445 | 0 |
| 0.9951388888888889 | 0 |
| 0.9958333333333332 | 0 |
| 0.9965277777777778 | 0 |
| 0.9972222222222222 | 0 |
| 0.9979166666666667 | 0 |
| 0.998611111111111 | 0 |
| 0.9993055555555556 | 0 |